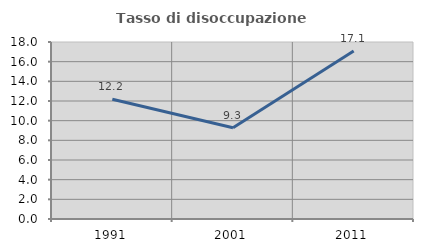
| Category | Tasso di disoccupazione giovanile  |
|---|---|
| 1991.0 | 12.177 |
| 2001.0 | 9.272 |
| 2011.0 | 17.094 |